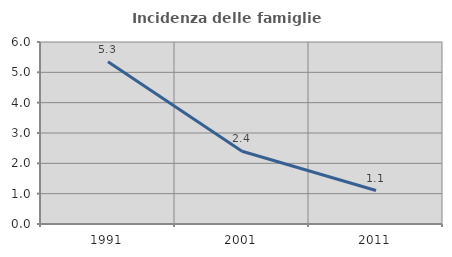
| Category | Incidenza delle famiglie numerose |
|---|---|
| 1991.0 | 5.347 |
| 2001.0 | 2.397 |
| 2011.0 | 1.103 |